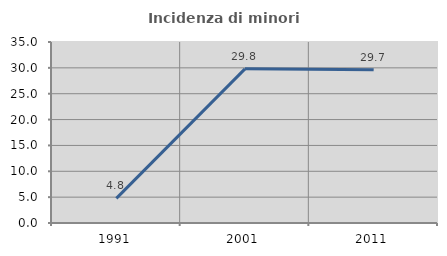
| Category | Incidenza di minori stranieri |
|---|---|
| 1991.0 | 4.762 |
| 2001.0 | 29.808 |
| 2011.0 | 29.65 |